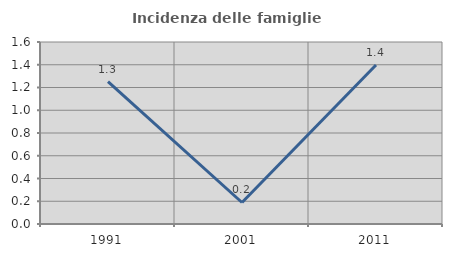
| Category | Incidenza delle famiglie numerose |
|---|---|
| 1991.0 | 1.252 |
| 2001.0 | 0.189 |
| 2011.0 | 1.397 |